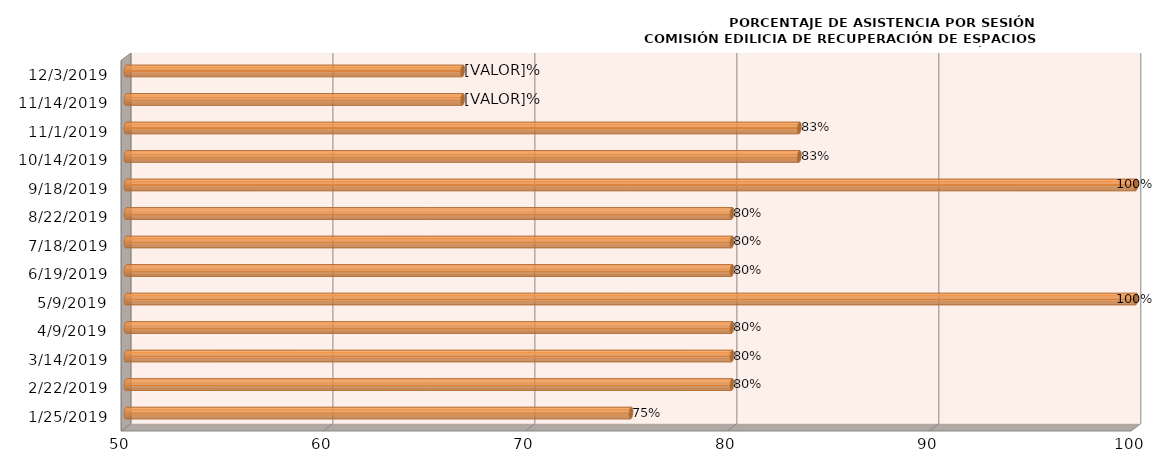
| Category | Series 0 |
|---|---|
| 1/25/19 | 75 |
| 2/22/19 | 80 |
| 3/14/19 | 80 |
| 4/9/19 | 80 |
| 5/9/19 | 100 |
| 6/19/19 | 80 |
| 7/18/19 | 80 |
| 8/22/19 | 80 |
| 9/18/19 | 100 |
| 10/14/19 | 83.333 |
| 11/1/19 | 83.333 |
| 11/14/19 | 66.667 |
| 12/3/19 | 66.667 |